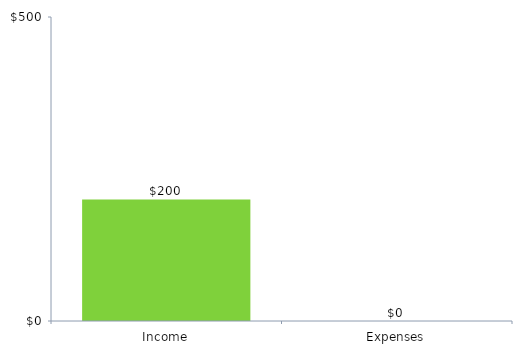
| Category | ChartData |
|---|---|
| 0 | 200 |
| 1 | 0 |